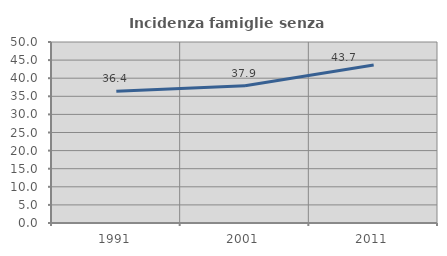
| Category | Incidenza famiglie senza nuclei |
|---|---|
| 1991.0 | 36.364 |
| 2001.0 | 37.931 |
| 2011.0 | 43.662 |